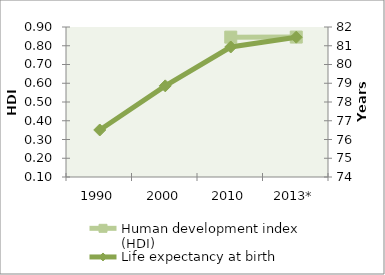
| Category | Human development index (HDI) |
|---|---|
| 1990 | 0 |
| 2000 | 0 |
| 2010 | 0.846 |
| 2013* | 0.846 |